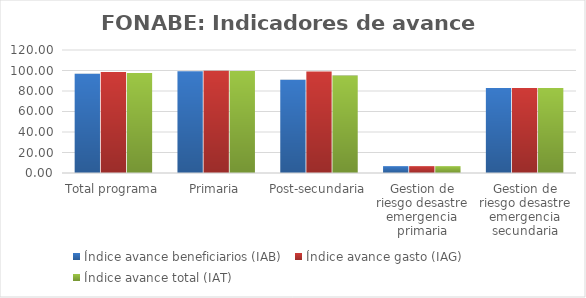
| Category | Índice avance beneficiarios (IAB)  | Índice avance gasto (IAG) | Índice avance total (IAT)  |
|---|---|---|---|
| Total programa | 96.87 | 98.447 | 97.658 |
| Primaria | 99.295 | 99.815 | 99.555 |
| Post-secundaria  | 91.068 | 99.037 | 95.053 |
| Gestion de riesgo desastre emergencia primaria | 6.684 | 6.684 | 6.684 |
| Gestion de riesgo desastre emergencia secundaria | 82.982 | 82.982 | 82.982 |